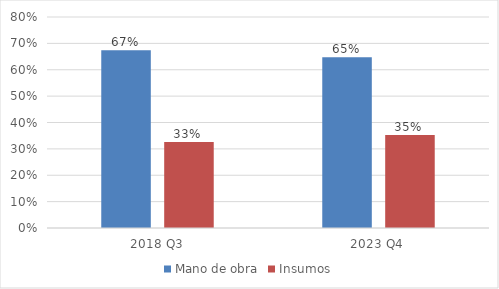
| Category | Mano de obra | Insumos |
|---|---|---|
| 2018 Q3 | 0.674 | 0.326 |
| 2023 Q4 | 0.647 | 0.353 |